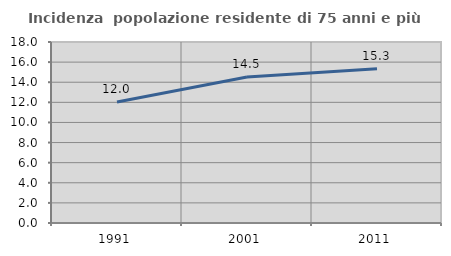
| Category | Incidenza  popolazione residente di 75 anni e più |
|---|---|
| 1991.0 | 12.026 |
| 2001.0 | 14.526 |
| 2011.0 | 15.347 |